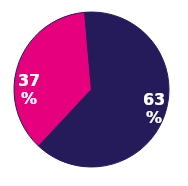
| Category | Series 0 |
|---|---|
| Male | 0.367 |
| Female | 0.633 |